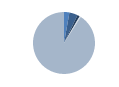
| Category | Series 0 |
|---|---|
| 0 | 22 |
| 1 | 34 |
| 2 | 10 |
| 3 | 5 |
| 4 | 709 |